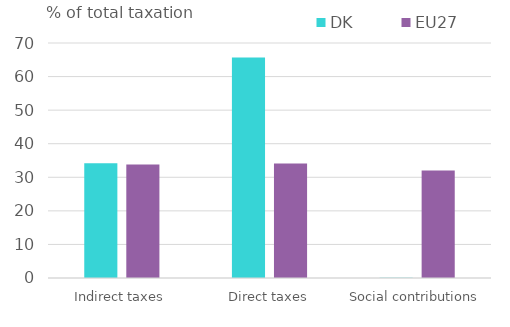
| Category | DK | EU27 |
|---|---|---|
| Indirect taxes | 34.2 | 33.811 |
| Direct taxes | 65.695 | 34.133 |
| Social contributions | 0.105 | 32.056 |